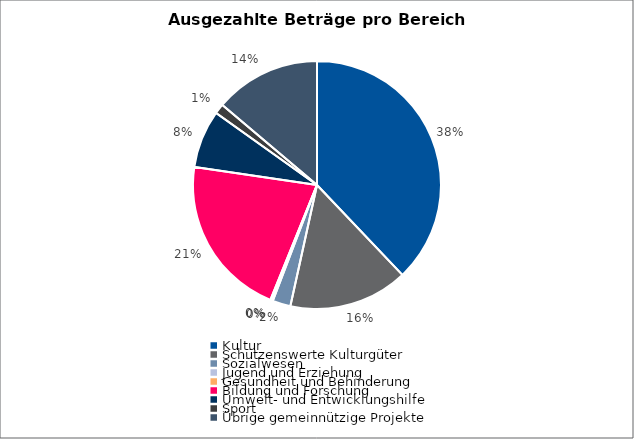
| Category | Series 0 |
|---|---|
| Kultur | 24950848.6 |
| Schützenswerte Kulturgüter | 10222300 |
| Sozialwesen | 1551972.5 |
| Jugend und Erziehung | 152010 |
| Gesundheit und Behinderung | 66433.5 |
| Bildung und Forschung | 13948402.38 |
| Umwelt- und Entwicklungshilfe | 4959720 |
| Sport | 855000 |
| Übrige gemeinnützige Projekte | 9104917.33 |